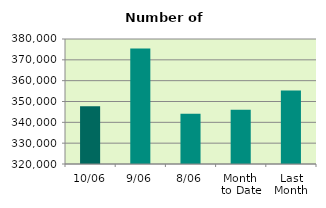
| Category | Series 0 |
|---|---|
| 10/06 | 347678 |
| 9/06 | 375474 |
| 8/06 | 344178 |
| Month 
to Date | 346066.857 |
| Last
Month | 355289.273 |